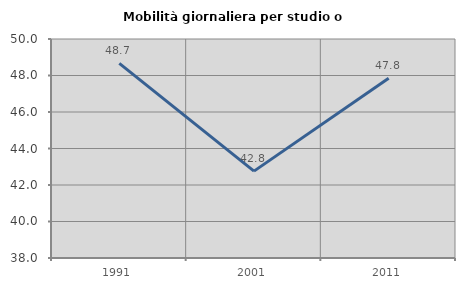
| Category | Mobilità giornaliera per studio o lavoro |
|---|---|
| 1991.0 | 48.664 |
| 2001.0 | 42.761 |
| 2011.0 | 47.848 |